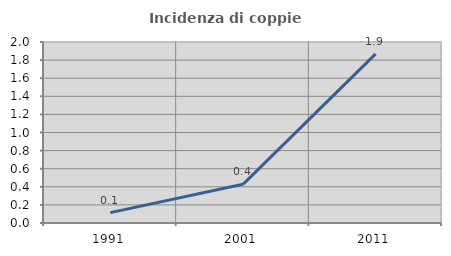
| Category | Incidenza di coppie miste |
|---|---|
| 1991.0 | 0.115 |
| 2001.0 | 0.427 |
| 2011.0 | 1.868 |